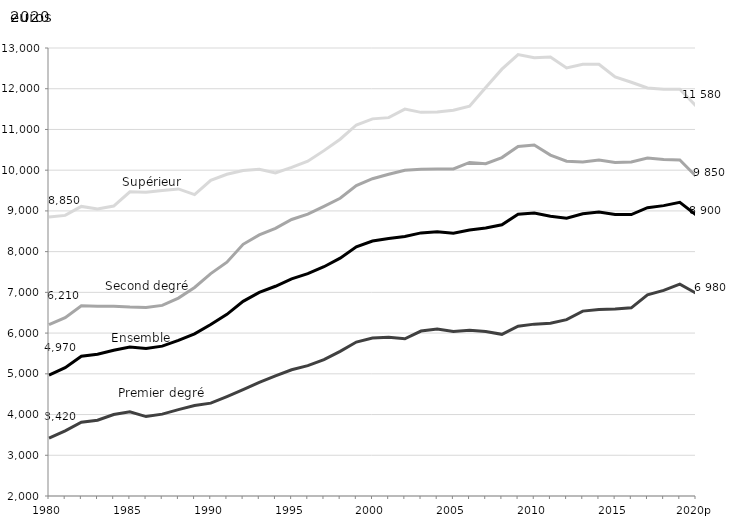
| Category | Premier degré | Second degré | Supérieur | Ensemble |
|---|---|---|---|---|
| 1980 | 3420 | 6210 | 8850 | 4970 |
| 1981 | 3600 | 6380 | 8890 | 5150 |
| 1982 | 3810 | 6670 | 9110 | 5430 |
| 1983 | 3860 | 6660 | 9050 | 5480 |
| 1984 | 4000 | 6660 | 9120 | 5580 |
| 1985 | 4070 | 6640 | 9470 | 5660 |
| 1986 | 3950 | 6630 | 9460 | 5620 |
| 1987 | 4010 | 6680 | 9500 | 5680 |
| 1988 | 4120 | 6860 | 9540 | 5820 |
| 1989 | 4220 | 7120 | 9400 | 5980 |
| 1990 | 4280 | 7460 | 9750 | 6210 |
| 1991 | 4440 | 7740 | 9900 | 6460 |
| 1992 | 4610 | 8180 | 9990 | 6780 |
| 1993 | 4790 | 8410 | 10020 | 7000 |
| 1994 | 4950 | 8570 | 9930 | 7150 |
| 1995 | 5100 | 8790 | 10070 | 7330 |
| 1996 | 5200 | 8920 | 10220 | 7460 |
| 1997 | 5350 | 9110 | 10480 | 7630 |
| 1998 | 5550 | 9310 | 10760 | 7840 |
| 1999 | 5780 | 9620 | 11110 | 8120 |
| 2000 | 5880 | 9790 | 11260 | 8260 |
| 2001 | 5900 | 9900 | 11290 | 8320 |
| 2002 | 5860 | 10000 | 11500 | 8370 |
| 2003 | 6050 | 10020 | 11420 | 8460 |
| 2004 | 6100 | 10030 | 11430 | 8490 |
| 2005 | 6040 | 10030 | 11470 | 8450 |
| 2006 | 6070 | 10190 | 11570 | 8530 |
| 2007 | 6040 | 10160 | 12030 | 8580 |
| 2008 | 5970 | 10310 | 12480 | 8660 |
| 2009 | 6170 | 10580 | 12840 | 8920 |
| 2010 | 6220 | 10620 | 12760 | 8950 |
| 2011 | 6240 | 10370 | 12780 | 8870 |
| 2012 | 6330 | 10220 | 12510 | 8820 |
| 2013 | 6540 | 10200 | 12600 | 8930 |
| 2014 | 6580 | 10250 | 12600 | 8970 |
| 2015 | 6590 | 10190 | 12290 | 8910 |
| 2016 | 6620 | 10200 | 12160 | 8910 |
| 2017 | 6940 | 10300 | 12020 | 9080 |
| 2018 | 7050 | 10260 | 11990 | 9130 |
| 2019 | 7200 | 10250 | 11990 | 9210 |
| 2020p | 6980 | 9850 | 11580 | 8900 |